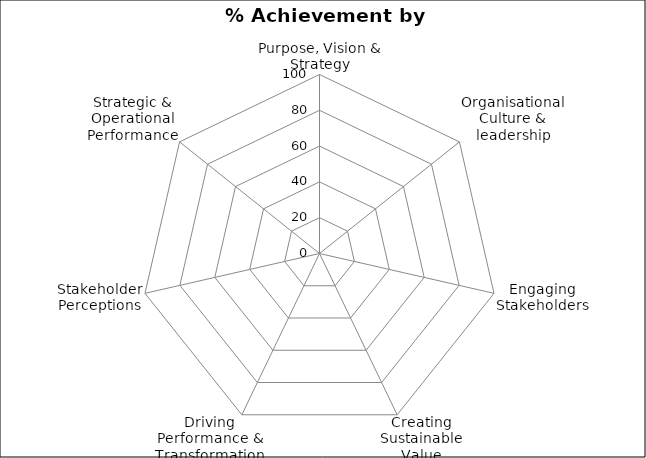
| Category | Target | % Score |
|---|---|---|
| Purpose, Vision & Strategy | 0 | 0 |
| Organisational Culture & leadership | 0 | 0 |
| Engaging Stakeholders | 0 | 0 |
| Creating Sustainable Value | 0 | 0 |
| Driving Performance & Transformation | 0 | 0 |
| Stakeholder Perceptions | 0 | 0 |
| Strategic & Operational Performance | 0 | 0 |